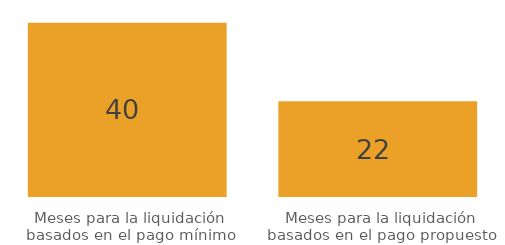
| Category | Series 0 |
|---|---|
| Meses para la liquidación basados en el pago mínimo | 40 |
| Meses para la liquidación basados en el pago propuesto | 22 |